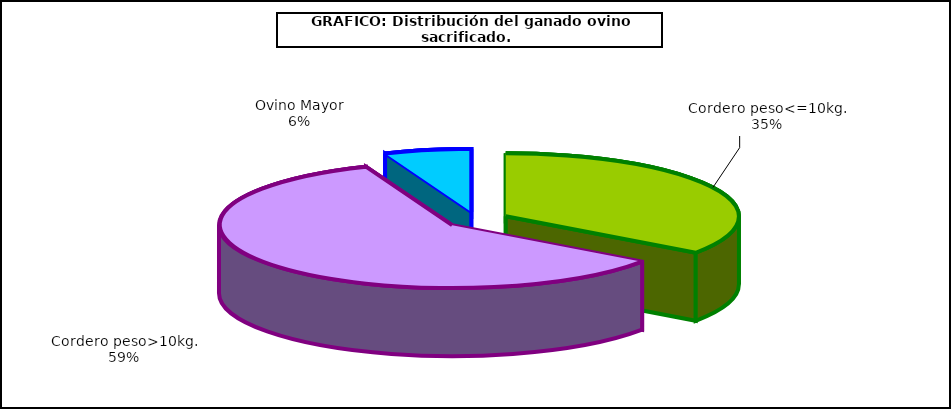
| Category | Series 0 |
|---|---|
| 0 | 3523522 |
| 1 | 5979250 |
| 2 | 609555 |